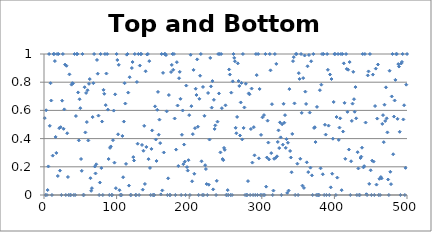
| Category | Top and Bottom Slice |
|---|---|
| 0 | 0.545 |
| 1 | 0 |
| 2 | 0.601 |
| 3 | 0 |
| 4 | 0.035 |
| 5 | 0.203 |
| 6 | 1 |
| 7 | 0.491 |
| 8 | 0.793 |
| 9 | 0.67 |
| 10 | 0 |
| 11 | 0.279 |
| 12 | 1 |
| 13 | 1 |
| 14 | 0.95 |
| 15 | 0.412 |
| 16 | 0.298 |
| 17 | 1 |
| 18 | 0.135 |
| 19 | 1 |
| 20 | 0.474 |
| 21 | 0.173 |
| 22 | 0.481 |
| 23 | 0 |
| 24 | 0.669 |
| 25 | 1 |
| 26 | 0.469 |
| 27 | 0.607 |
| 28 | 0.925 |
| 29 | 0 |
| 30 | 0.917 |
| 31 | 0.438 |
| 32 | 0.128 |
| 33 | 0 |
| 34 | 0.856 |
| 35 | 0 |
| 36 | 0 |
| 37 | 0.783 |
| 38 | 0.793 |
| 39 | 0.791 |
| 40 | 0 |
| 41 | 1 |
| 42 | 0 |
| 43 | 0.56 |
| 44 | 1 |
| 45 | 1 |
| 46 | 0.727 |
| 47 | 0.387 |
| 48 | 0.679 |
| 49 | 0.616 |
| 50 | 0.255 |
| 51 | 0.171 |
| 52 | 1 |
| 53 | 0 |
| 54 | 0 |
| 55 | 0.764 |
| 56 | 0.444 |
| 57 | 0.724 |
| 58 | 0.517 |
| 59 | 0.743 |
| 60 | 0.387 |
| 61 | 0.789 |
| 62 | 0.822 |
| 63 | 0.119 |
| 64 | 0.03 |
| 65 | 0.048 |
| 66 | 0.553 |
| 67 | 0.793 |
| 68 | 1 |
| 69 | 0.202 |
| 70 | 0.153 |
| 71 | 0.218 |
| 72 | 0.958 |
| 73 | 0.86 |
| 74 | 0.563 |
| 75 | 0 |
| 76 | 0.088 |
| 77 | 1 |
| 78 | 0.191 |
| 79 | 0.521 |
| 80 | 0 |
| 81 | 0.746 |
| 82 | 0.718 |
| 83 | 1 |
| 84 | 0.637 |
| 85 | 0.861 |
| 86 | 1 |
| 87 | 0.605 |
| 88 | 0.255 |
| 89 | 0 |
| 90 | 0.334 |
| 91 | 0.344 |
| 92 | 0 |
| 93 | 0 |
| 94 | 0.389 |
| 95 | 0.599 |
| 96 | 0.229 |
| 97 | 0.714 |
| 98 | 0.049 |
| 99 | 1 |
| 100 | 0.957 |
| 101 | 0.431 |
| 102 | 0.923 |
| 103 | 0.034 |
| 104 | 0 |
| 105 | 0 |
| 106 | 0 |
| 107 | 0.419 |
| 108 | 0.126 |
| 109 | 0.521 |
| 110 | 0.793 |
| 111 | 0.649 |
| 112 | 0.221 |
| 113 | 0.995 |
| 114 | 1 |
| 115 | 0.726 |
| 116 | 0.067 |
| 117 | 0.835 |
| 118 | 0 |
| 119 | 0 |
| 120 | 0.9 |
| 121 | 0.943 |
| 122 | 0.269 |
| 123 | 0.245 |
| 124 | 1 |
| 125 | 0 |
| 126 | 0 |
| 127 | 0.802 |
| 128 | 0.364 |
| 129 | 1 |
| 130 | 0 |
| 131 | 0.918 |
| 132 | 1 |
| 133 | 1 |
| 134 | 0.355 |
| 135 | 0.038 |
| 136 | 0.314 |
| 137 | 0.49 |
| 138 | 0.078 |
| 139 | 0.878 |
| 140 | 0.341 |
| 141 | 0.997 |
| 142 | 1 |
| 143 | 0.254 |
| 144 | 0.95 |
| 145 | 0.192 |
| 146 | 0 |
| 147 | 0.327 |
| 148 | 0.458 |
| 149 | 0 |
| 150 | 0 |
| 151 | 0 |
| 152 | 0.629 |
| 153 | 0.394 |
| 154 | 0.241 |
| 155 | 0.604 |
| 156 | 0.731 |
| 157 | 0.428 |
| 158 | 0.535 |
| 159 | 0.368 |
| 160 | 0.004 |
| 161 | 1 |
| 162 | 0.033 |
| 163 | 0.866 |
| 164 | 0.302 |
| 165 | 1 |
| 166 | 1 |
| 167 | 0.992 |
| 168 | 0.594 |
| 169 | 0 |
| 170 | 0.118 |
| 171 | 0.709 |
| 172 | 0 |
| 173 | 0 |
| 174 | 0.872 |
| 175 | 0.922 |
| 176 | 1 |
| 177 | 0.888 |
| 178 | 1 |
| 179 | 0.543 |
| 180 | 0 |
| 181 | 0.322 |
| 182 | 0.942 |
| 183 | 0.635 |
| 184 | 0.205 |
| 185 | 0.828 |
| 186 | 0.873 |
| 187 | 0.682 |
| 188 | 0 |
| 189 | 0.427 |
| 190 | 0.599 |
| 191 | 0.219 |
| 192 | 0.358 |
| 193 | 0.237 |
| 194 | 0 |
| 195 | 0.776 |
| 196 | 0.198 |
| 197 | 0.173 |
| 198 | 0.247 |
| 199 | 0.566 |
| 200 | 0 |
| 201 | 0.995 |
| 202 | 0.63 |
| 203 | 0.097 |
| 204 | 0.432 |
| 205 | 0.887 |
| 206 | 0.151 |
| 207 | 0.474 |
| 208 | 0.754 |
| 209 | 0.709 |
| 210 | 0.962 |
| 211 | 0.484 |
| 212 | 0 |
| 213 | 0.682 |
| 214 | 0.846 |
| 215 | 1 |
| 216 | 0.239 |
| 217 | 0 |
| 218 | 0.766 |
| 219 | 0 |
| 220 | 0.562 |
| 221 | 0.211 |
| 222 | 0.184 |
| 223 | 0.078 |
| 224 | 0 |
| 225 | 0.724 |
| 226 | 0.073 |
| 227 | 0.393 |
| 228 | 0.972 |
| 229 | 0.77 |
| 230 | 0.62 |
| 231 | 0.808 |
| 232 | 0.04 |
| 233 | 0.675 |
| 234 | 0.468 |
| 235 | 0.494 |
| 236 | 0 |
| 237 | 0.1 |
| 238 | 0.52 |
| 239 | 1 |
| 240 | 0.72 |
| 241 | 1 |
| 242 | 0.302 |
| 243 | 1 |
| 244 | 0.616 |
| 245 | 0.255 |
| 246 | 0.247 |
| 247 | 0.334 |
| 248 | 0.32 |
| 249 | 0.636 |
| 250 | 0 |
| 251 | 0 |
| 252 | 0.035 |
| 253 | 0 |
| 254 | 0.89 |
| 255 | 0.854 |
| 256 | 0 |
| 257 | 0.726 |
| 258 | 0 |
| 259 | 0.806 |
| 260 | 1 |
| 261 | 0.973 |
| 262 | 0.948 |
| 263 | 0.476 |
| 264 | 0.438 |
| 265 | 0.554 |
| 266 | 0.934 |
| 267 | 0.809 |
| 268 | 0.773 |
| 269 | 0.422 |
| 270 | 0.656 |
| 271 | 0.795 |
| 272 | 0.394 |
| 273 | 1 |
| 274 | 0.476 |
| 275 | 0.621 |
| 276 | 0 |
| 277 | 0.789 |
| 278 | 0 |
| 279 | 0 |
| 280 | 0.099 |
| 281 | 0.721 |
| 282 | 0.714 |
| 283 | 0 |
| 284 | 0.468 |
| 285 | 0.755 |
| 286 | 0.23 |
| 287 | 0 |
| 288 | 0.481 |
| 289 | 0.282 |
| 290 | 0 |
| 291 | 1 |
| 292 | 0.85 |
| 293 | 0 |
| 294 | 1 |
| 295 | 0.26 |
| 296 | 0.752 |
| 297 | 0 |
| 298 | 0.426 |
| 299 | 0 |
| 300 | 0.551 |
| 301 | 0 |
| 302 | 0.567 |
| 303 | 0 |
| 304 | 1 |
| 305 | 0.059 |
| 306 | 0.266 |
| 307 | 0.527 |
| 308 | 0.372 |
| 309 | 0.253 |
| 310 | 1 |
| 311 | 0.884 |
| 312 | 0.297 |
| 313 | 0.644 |
| 314 | 0 |
| 315 | 0.031 |
| 316 | 0.257 |
| 317 | 1 |
| 318 | 0.264 |
| 319 | 0.93 |
| 320 | 0.274 |
| 321 | 0.376 |
| 322 | 0.459 |
| 323 | 0.333 |
| 324 | 0.515 |
| 325 | 0.409 |
| 326 | 0 |
| 327 | 0.502 |
| 328 | 0.357 |
| 329 | 0.647 |
| 330 | 0.513 |
| 331 | 0.566 |
| 332 | 0.334 |
| 333 | 0.397 |
| 334 | 0.015 |
| 335 | 0.371 |
| 336 | 0.031 |
| 337 | 0.751 |
| 338 | 0.312 |
| 339 | 0.266 |
| 340 | 0.161 |
| 341 | 0.433 |
| 342 | 0.949 |
| 343 | 0.978 |
| 344 | 0.65 |
| 345 | 0 |
| 346 | 1 |
| 347 | 1 |
| 348 | 0.222 |
| 349 | 0 |
| 350 | 0.864 |
| 351 | 0.823 |
| 352 | 0.257 |
| 353 | 1 |
| 354 | 0.582 |
| 355 | 0.066 |
| 356 | 0.829 |
| 357 | 0.05 |
| 358 | 0.989 |
| 359 | 0.733 |
| 360 | 0.646 |
| 361 | 0.232 |
| 362 | 0.913 |
| 363 | 0.163 |
| 364 | 0.993 |
| 365 | 0.584 |
| 366 | 0.194 |
| 367 | 0.948 |
| 368 | 0.139 |
| 369 | 0 |
| 370 | 1 |
| 371 | 0.476 |
| 372 | 0.481 |
| 373 | 0.376 |
| 374 | 0 |
| 375 | 0.625 |
| 376 | 0 |
| 377 | 0 |
| 378 | 0 |
| 379 | 0.743 |
| 380 | 0.189 |
| 381 | 0.782 |
| 382 | 1 |
| 383 | 0.147 |
| 384 | 1 |
| 385 | 0 |
| 386 | 0.498 |
| 387 | 0.428 |
| 388 | 0 |
| 389 | 1 |
| 390 | 0.888 |
| 391 | 0.492 |
| 392 | 0 |
| 393 | 0.855 |
| 394 | 0.054 |
| 395 | 0.823 |
| 396 | 0.151 |
| 397 | 0.399 |
| 398 | 0.66 |
| 399 | 1 |
| 400 | 1 |
| 401 | 0 |
| 402 | 0.553 |
| 403 | 0.123 |
| 404 | 1 |
| 405 | 0.391 |
| 406 | 0.478 |
| 407 | 0.544 |
| 408 | 1 |
| 409 | 0.034 |
| 410 | 1 |
| 411 | 0.45 |
| 412 | 0.934 |
| 413 | 0.654 |
| 414 | 0.257 |
| 415 | 1 |
| 416 | 0.894 |
| 417 | 0.59 |
| 418 | 0.889 |
| 419 | 0.322 |
| 420 | 0.943 |
| 421 | 0 |
| 422 | 0.239 |
| 423 | 0.526 |
| 424 | 0.648 |
| 425 | 0.874 |
| 426 | 0.679 |
| 427 | 0.59 |
| 428 | 0.765 |
| 429 | 0.544 |
| 430 | 0 |
| 431 | 0.304 |
| 432 | 0.188 |
| 433 | 0 |
| 434 | 0 |
| 435 | 0.262 |
| 436 | 0.272 |
| 437 | 0.335 |
| 438 | 1 |
| 439 | 0.196 |
| 440 | 0.205 |
| 441 | 1 |
| 442 | 0.514 |
| 443 | 0.005 |
| 444 | 0 |
| 445 | 0.848 |
| 446 | 0.877 |
| 447 | 0.079 |
| 448 | 1 |
| 449 | 0.175 |
| 450 | 0 |
| 451 | 0.244 |
| 452 | 0.854 |
| 453 | 0.237 |
| 454 | 0 |
| 455 | 0.631 |
| 456 | 0.896 |
| 457 | 0.074 |
| 458 | 0.542 |
| 459 | 0.925 |
| 460 | 0 |
| 461 | 0.115 |
| 462 | 0 |
| 463 | 0.127 |
| 464 | 0.118 |
| 465 | 0.504 |
| 466 | 0.566 |
| 467 | 0.375 |
| 468 | 0.64 |
| 469 | 0.525 |
| 470 | 0.764 |
| 471 | 0.544 |
| 472 | 0.444 |
| 473 | 0.11 |
| 474 | 0 |
| 475 | 0.881 |
| 476 | 0.165 |
| 477 | 0.077 |
| 478 | 0.699 |
| 479 | 1 |
| 480 | 0.289 |
| 481 | 0.556 |
| 482 | 0.67 |
| 483 | 0.816 |
| 484 | 1 |
| 485 | 1 |
| 486 | 0.54 |
| 487 | 0.929 |
| 488 | 0.911 |
| 489 | 0.448 |
| 490 | 0 |
| 491 | 0.933 |
| 492 | 0.944 |
| 493 | 1 |
| 494 | 0.536 |
| 495 | 0.636 |
| 496 | 0 |
| 497 | 0.192 |
| 498 | 0.782 |
| 499 | 1 |